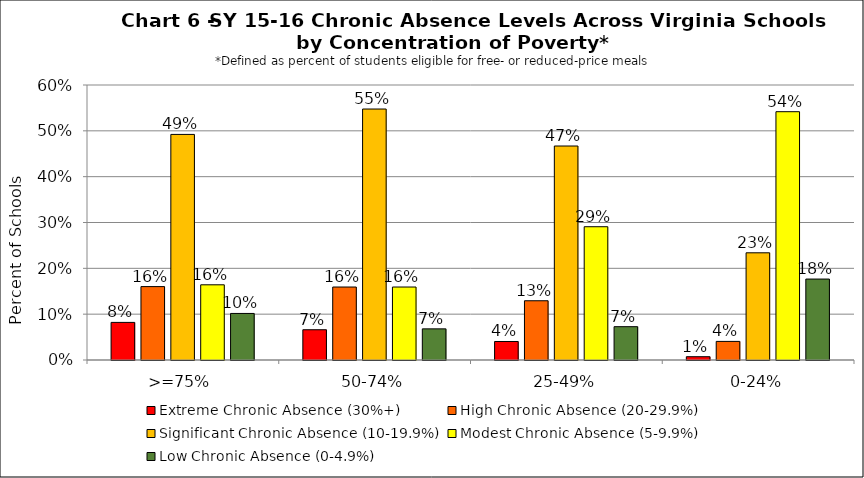
| Category | Extreme Chronic Absence (30%+) | High Chronic Absence (20-29.9%) | Significant Chronic Absence (10-19.9%) | Modest Chronic Absence (5-9.9%) | Low Chronic Absence (0-4.9%) |
|---|---|---|---|---|---|
| 0 | 0.082 | 0.16 | 0.492 | 0.164 | 0.102 |
| 1 | 0.066 | 0.159 | 0.548 | 0.159 | 0.068 |
| 2 | 0.04 | 0.129 | 0.467 | 0.291 | 0.073 |
| 3 | 0.007 | 0.041 | 0.234 | 0.542 | 0.177 |